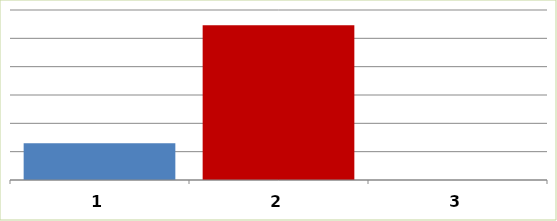
| Category | Series 0 |
|---|---|
| 0 | 6504024.86 |
| 1 | 27319978 |
| 2 | 0 |